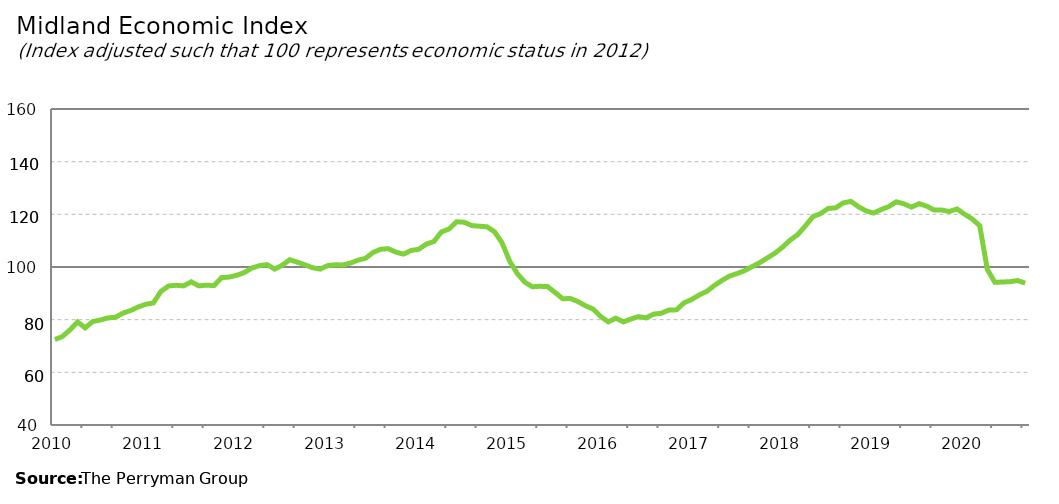
| Category | Midland Composite |
|---|---|
| 2010-01-31 | 72.466 |
| 2010-02-28 | 73.576 |
| 2010-03-31 | 76.111 |
| 2010-04-30 | 79.126 |
| 2010-05-31 | 76.891 |
| 2010-06-30 | 79.283 |
| 2010-07-31 | 79.854 |
| 2010-08-31 | 80.644 |
| 2010-09-30 | 80.9 |
| 2010-10-31 | 82.478 |
| 2010-11-30 | 83.463 |
| 2010-12-31 | 84.824 |
| 2011-01-31 | 85.829 |
| 2011-02-28 | 86.371 |
| 2011-03-31 | 90.737 |
| 2011-04-30 | 92.789 |
| 2011-05-31 | 93.053 |
| 2011-06-30 | 92.828 |
| 2011-07-31 | 94.372 |
| 2011-08-31 | 92.826 |
| 2011-09-30 | 93.109 |
| 2011-10-31 | 92.934 |
| 2011-11-30 | 95.972 |
| 2011-12-31 | 96.172 |
| 2012-01-31 | 96.847 |
| 2012-02-29 | 97.901 |
| 2012-03-31 | 99.622 |
| 2012-04-30 | 100.512 |
| 2012-05-31 | 100.921 |
| 2012-06-30 | 99.195 |
| 2012-07-31 | 100.675 |
| 2012-08-31 | 102.782 |
| 2012-09-30 | 101.829 |
| 2012-10-31 | 100.823 |
| 2012-11-30 | 99.73 |
| 2012-12-31 | 99.202 |
| 2013-01-31 | 100.538 |
| 2013-02-28 | 100.848 |
| 2013-03-31 | 100.753 |
| 2013-04-30 | 101.496 |
| 2013-05-31 | 102.599 |
| 2013-06-30 | 103.307 |
| 2013-07-31 | 105.572 |
| 2013-08-31 | 106.742 |
| 2013-09-30 | 106.955 |
| 2013-10-31 | 105.617 |
| 2013-11-30 | 104.892 |
| 2013-12-31 | 106.278 |
| 2014-01-31 | 106.733 |
| 2014-02-28 | 108.695 |
| 2014-03-31 | 109.67 |
| 2014-04-30 | 113.325 |
| 2014-05-31 | 114.425 |
| 2014-06-30 | 117.187 |
| 2014-07-31 | 117.005 |
| 2014-08-31 | 115.726 |
| 2014-09-30 | 115.495 |
| 2014-10-31 | 115.264 |
| 2014-11-30 | 113.388 |
| 2014-12-31 | 109.153 |
| 2015-01-31 | 102.217 |
| 2015-02-28 | 97.515 |
| 2015-03-31 | 94.235 |
| 2015-04-30 | 92.491 |
| 2015-05-31 | 92.671 |
| 2015-06-30 | 92.561 |
| 2015-07-31 | 90.312 |
| 2015-08-31 | 87.949 |
| 2015-09-30 | 88.042 |
| 2015-10-31 | 86.879 |
| 2015-11-30 | 85.276 |
| 2015-12-31 | 84.035 |
| 2016-01-31 | 81.219 |
| 2016-02-29 | 79.165 |
| 2016-03-31 | 80.565 |
| 2016-04-30 | 79.157 |
| 2016-05-31 | 80.264 |
| 2016-06-30 | 81.159 |
| 2016-07-31 | 80.68 |
| 2016-08-31 | 82.112 |
| 2016-09-30 | 82.435 |
| 2016-10-31 | 83.663 |
| 2016-11-30 | 83.723 |
| 2016-12-31 | 86.408 |
| 2017-01-31 | 87.652 |
| 2017-02-28 | 89.39 |
| 2017-03-31 | 90.747 |
| 2017-04-30 | 92.981 |
| 2017-05-31 | 94.882 |
| 2017-06-30 | 96.557 |
| 2017-07-31 | 97.519 |
| 2017-08-31 | 98.633 |
| 2017-09-30 | 100.178 |
| 2017-10-31 | 101.678 |
| 2017-11-30 | 103.465 |
| 2017-12-31 | 105.27 |
| 2018-01-31 | 107.544 |
| 2018-02-28 | 110.203 |
| 2018-03-31 | 112.318 |
| 2018-04-30 | 115.586 |
| 2018-05-31 | 119.132 |
| 2018-06-30 | 120.287 |
| 2018-07-31 | 122.216 |
| 2018-08-31 | 122.469 |
| 2018-09-30 | 124.329 |
| 2018-10-31 | 124.919 |
| 2018-11-30 | 122.905 |
| 2018-12-31 | 121.313 |
| 2019-01-31 | 120.48 |
| 2019-02-28 | 121.829 |
| 2019-03-31 | 122.953 |
| 2019-04-30 | 124.752 |
| 2019-05-31 | 123.996 |
| 2019-06-30 | 122.729 |
| 2019-07-31 | 124.05 |
| 2019-08-31 | 123.119 |
| 2019-09-30 | 121.612 |
| 2019-10-31 | 121.615 |
| 2019-11-30 | 121.072 |
| 2019-12-31 | 122.048 |
| 2020-01-31 | 120.049 |
| 2020-02-29 | 118.227 |
| 2020-03-31 | 115.684 |
| 2020-04-30 | 99.117 |
| 2020-05-31 | 94.175 |
| 2020-06-30 | 94.311 |
| 2020-07-31 | 94.417 |
| 2020-08-31 | 94.861 |
| 2020-09-30 | 93.866 |